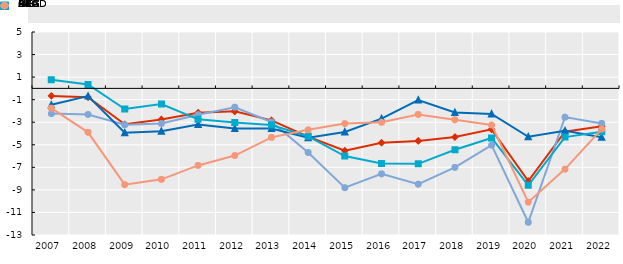
| Category | LAC | BRA | MEX | ARG | OECD |
|---|---|---|---|---|---|
| 2007.0 | -0.665 | -2.232 | -1.458 | 0.757 | -1.757 |
| 2008.0 | -0.789 | -2.315 | -0.681 | 0.352 | -3.895 |
| 2009.0 | -3.182 | -3.22 | -3.935 | -1.83 | -8.539 |
| 2010.0 | -2.753 | -3.107 | -3.804 | -1.393 | -8.066 |
| 2011.0 | -2.151 | -2.337 | -3.204 | -2.746 | -6.831 |
| 2012.0 | -2.038 | -1.67 | -3.566 | -3.018 | -5.956 |
| 2013.0 | -2.835 | -2.979 | -3.559 | -3.254 | -4.343 |
| 2014.0 | -4.281 | -5.686 | -4.371 | -4.252 | -3.67 |
| 2015.0 | -5.529 | -8.801 | -3.859 | -6.001 | -3.122 |
| 2016.0 | -4.819 | -7.582 | -2.681 | -6.655 | -3.007 |
| 2017.0 | -4.655 | -8.498 | -1.034 | -6.693 | -2.313 |
| 2018.0 | -4.316 | -7.009 | -2.139 | -5.441 | -2.785 |
| 2019.0 | -3.628 | -5.032 | -2.264 | -4.395 | -3.248 |
| 2020.0 | -8.217 | -11.87 | -4.291 | -8.588 | -10.092 |
| 2021.0 | -3.838 | -2.545 | -3.758 | -4.321 | -7.155 |
| 2022.0 | -3.358 | -3.105 | -4.326 | -3.849 | -3.606 |